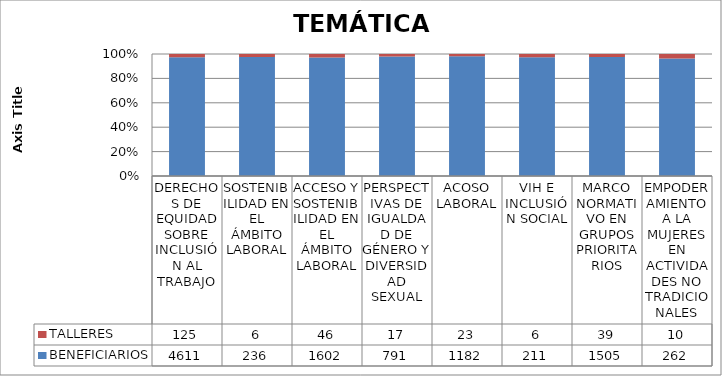
| Category | BENEFICIARIOS | TALLERES |
|---|---|---|
| DERECHOS DE EQUIDAD SOBRE INCLUSIÓN AL TRABAJO | 4611 | 125 |
| SOSTENIBILIDAD EN EL ÁMBITO LABORAL | 236 | 6 |
| ACCESO Y SOSTENIBILIDAD EN EL ÁMBITO LABORAL | 1602 | 46 |
| PERSPECTIVAS DE IGUALDAD DE GÉNERO Y DIVERSIDAD SEXUAL | 791 | 17 |
| ACOSO LABORAL | 1182 | 23 |
| VIH E INCLUSIÓN SOCIAL | 211 | 6 |
| MARCO NORMATIVO EN GRUPOS PRIORITARIOS | 1505 | 39 |
| EMPODERAMIENTO A LA MUJERES EN ACTIVIDADES NO TRADICIONALES | 262 | 10 |